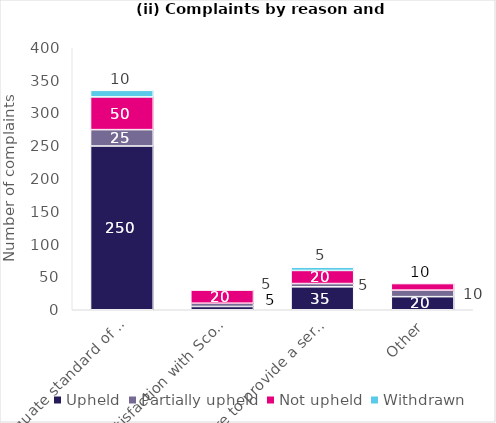
| Category | Upheld | Partially upheld | Not upheld | Withdrawn |
|---|---|---|---|---|
| Inadequate standard of service | 250 | 25 | 50 | 10 |
| Dissatisfaction with Scottish Government policy | 5 | 5 | 20 | 0 |
| Failure to provide a service | 35 | 5 | 20 | 5 |
| Other | 20 | 10 | 10 | 0 |